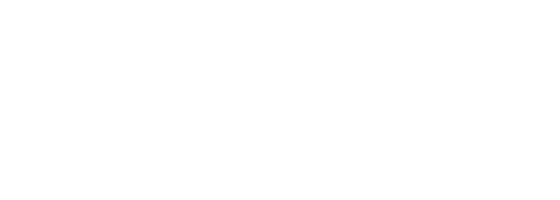
| Category | Series 0 |
|---|---|
| Si | 0 |
| No | 0 |